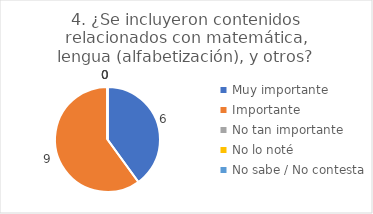
| Category | 4. ¿Se incluyeron contenidos relacionados con matemática, lengua (alfabetización), y otros? |
|---|---|
| Muy importante  | 0.4 |
| Importante  | 0.6 |
| No tan importante  | 0 |
| No lo noté  | 0 |
| No sabe / No contesta | 0 |